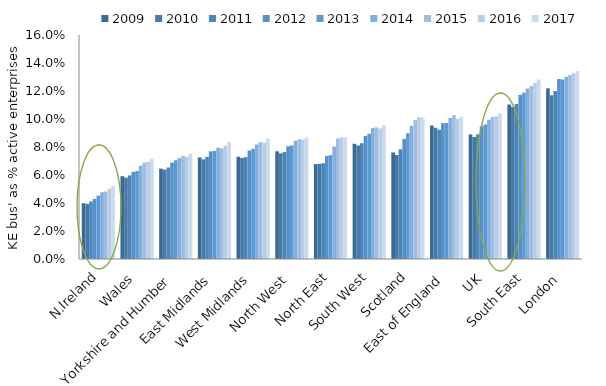
| Category | 2009 | 2010 | 2011 | 2012 | 2013 | 2014 | 2015 | 2016 | 2017 |
|---|---|---|---|---|---|---|---|---|---|
| N.Ireland | 0.04 | 0.039 | 0.041 | 0.043 | 0.045 | 0.048 | 0.048 | 0.05 | 0.052 |
| Wales | 0.059 | 0.058 | 0.06 | 0.062 | 0.063 | 0.067 | 0.069 | 0.069 | 0.071 |
| Yorkshire and Humber | 0.065 | 0.064 | 0.065 | 0.069 | 0.071 | 0.072 | 0.074 | 0.073 | 0.075 |
| East Midlands | 0.073 | 0.071 | 0.073 | 0.077 | 0.077 | 0.079 | 0.079 | 0.081 | 0.084 |
| West Midlands | 0.073 | 0.072 | 0.073 | 0.078 | 0.079 | 0.082 | 0.084 | 0.083 | 0.086 |
| North West | 0.077 | 0.075 | 0.076 | 0.081 | 0.081 | 0.085 | 0.086 | 0.085 | 0.087 |
| North East | 0.068 | 0.068 | 0.068 | 0.074 | 0.074 | 0.08 | 0.086 | 0.087 | 0.087 |
| South West | 0.082 | 0.081 | 0.083 | 0.088 | 0.089 | 0.094 | 0.094 | 0.093 | 0.096 |
| Scotland | 0.076 | 0.074 | 0.078 | 0.086 | 0.09 | 0.095 | 0.099 | 0.101 | 0.101 |
| East of England | 0.095 | 0.094 | 0.092 | 0.097 | 0.097 | 0.101 | 0.103 | 0.1 | 0.102 |
| UK | 0.089 | 0.087 | 0.089 | 0.095 | 0.096 | 0.099 | 0.101 | 0.102 | 0.104 |
| South East | 0.11 | 0.109 | 0.111 | 0.117 | 0.119 | 0.122 | 0.124 | 0.126 | 0.128 |
| London | 0.122 | 0.117 | 0.12 | 0.129 | 0.128 | 0.13 | 0.131 | 0.133 | 0.134 |